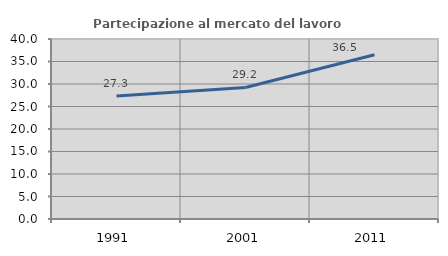
| Category | Partecipazione al mercato del lavoro  femminile |
|---|---|
| 1991.0 | 27.342 |
| 2001.0 | 29.223 |
| 2011.0 | 36.486 |